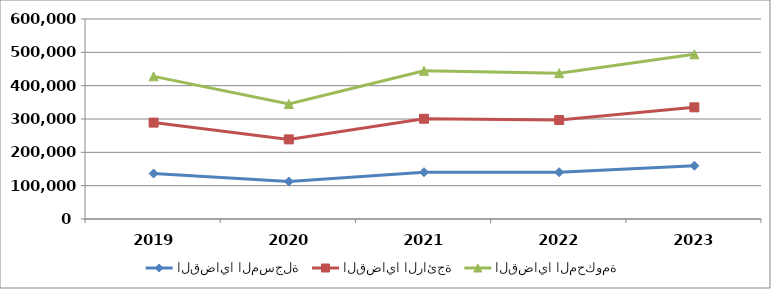
| Category | القضايا المسجلة | القضايا الرائجة | القضايا المحكومة |
|---|---|---|---|
| 2019.0 | 136515 | 152680 | 138733 |
| 2020.0 | 112360 | 126502 | 106246 |
| 2021.0 | 140262 | 160504 | 143744 |
| 2022.0 | 140305 | 156534 | 140656 |
| 2023.0 | 159758 | 175263 | 158962 |